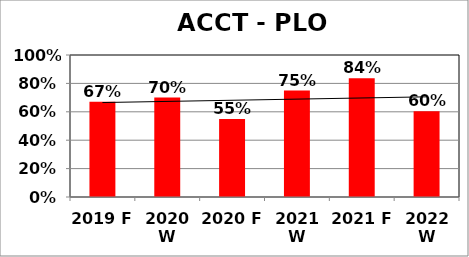
| Category | Series 0 |
|---|---|
| 2019 F | 0.67 |
| 2020 W | 0.7 |
| 2020 F | 0.55 |
| 2021 W | 0.75 |
| 2021 F | 0.837 |
| 2022 W | 0.605 |